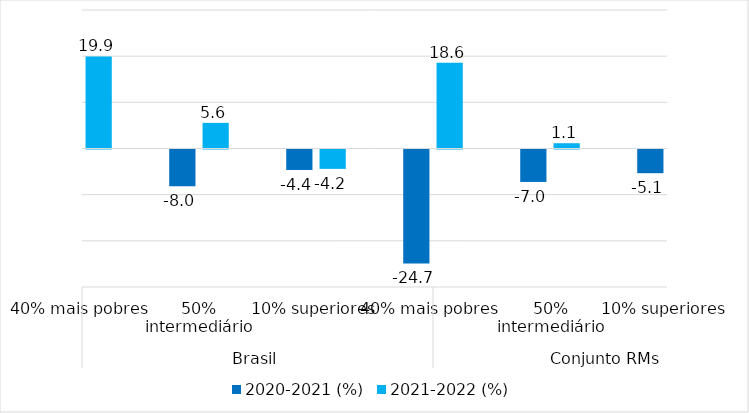
| Category | 2020-2021 (%) | 2021-2022 (%) |
|---|---|---|
| 0 | -18.309 | 19.931 |
| 1 | -7.979 | 5.554 |
| 2 | -4.433 | -4.2 |
| 3 | -24.687 | 18.573 |
| 4 | -7.026 | 1.143 |
| 5 | -5.131 | -10.632 |